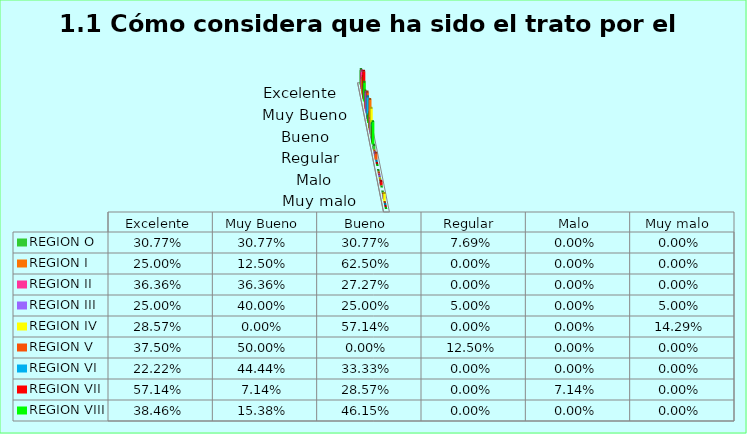
| Category | REGION O | REGION I  | REGION II | REGION III | REGION IV | REGION V  | REGION VI  | REGION VII  | REGION VIII |
|---|---|---|---|---|---|---|---|---|---|
| Excelente | 0.308 | 0.25 | 0.364 | 0.25 | 0.286 | 0.375 | 0.222 | 0.571 | 0.385 |
| Muy Bueno | 0.308 | 0.125 | 0.364 | 0.4 | 0 | 0.5 | 0.444 | 0.071 | 0.154 |
| Bueno  | 0.308 | 0.625 | 0.273 | 0.25 | 0.571 | 0 | 0.333 | 0.286 | 0.462 |
| Regular  | 0.077 | 0 | 0 | 0.05 | 0 | 0.125 | 0 | 0 | 0 |
| Malo  | 0 | 0 | 0 | 0 | 0 | 0 | 0 | 0.071 | 0 |
| Muy malo  | 0 | 0 | 0 | 0.05 | 0.143 | 0 | 0 | 0 | 0 |